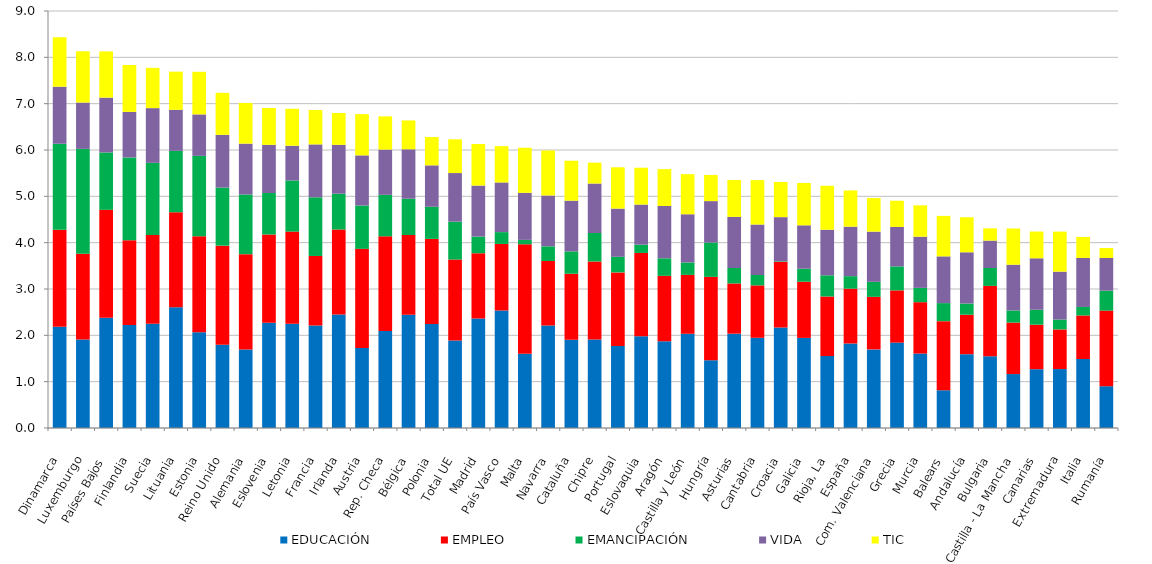
| Category | EDUCACIÓN | EMPLEO | EMANCIPACIÓN | VIDA | TIC |
|---|---|---|---|---|---|
| Dinamarca | 2.185 | 2.095 | 1.855 | 1.231 | 1.067 |
| Luxemburgo | 1.912 | 1.848 | 2.264 | 1 | 1.107 |
| Países Bajos | 2.382 | 2.327 | 1.239 | 1.182 | 0.997 |
| Finlandia | 2.22 | 1.83 | 1.789 | 0.983 | 1.012 |
| Suecia | 2.248 | 1.916 | 1.558 | 1.181 | 0.869 |
| Lituania | 2.605 | 2.052 | 1.325 | 0.885 | 0.825 |
| Estonia | 2.066 | 2.073 | 1.735 | 0.895 | 0.92 |
| Reino Unido | 1.794 | 2.141 | 1.253 | 1.138 | 0.906 |
| Alemania | 1.695 | 2.056 | 1.289 | 1.097 | 0.878 |
| Eslovenia | 2.27 | 1.906 | 0.895 | 1.04 | 0.795 |
| Letonia | 2.25 | 1.989 | 1.104 | 0.749 | 0.798 |
| Francia | 2.215 | 1.499 | 1.267 | 1.141 | 0.742 |
| Irlanda | 2.449 | 1.834 | 0.773 | 1.054 | 0.688 |
| Austria | 1.726 | 2.14 | 0.936 | 1.082 | 0.89 |
| Rep. Checa | 2.095 | 2.041 | 0.895 | 0.977 | 0.717 |
| Bélgica | 2.443 | 1.723 | 0.782 | 1.068 | 0.622 |
| Polonia | 2.245 | 1.837 | 0.693 | 0.894 | 0.61 |
| Total UE | 1.886 | 1.75 | 0.818 | 1.049 | 0.728 |
| Madrid | 2.366 | 1.407 | 0.359 | 1.101 | 0.898 |
| País Vasco | 2.534 | 1.439 | 0.255 | 1.072 | 0.783 |
| Malta | 1.6 | 2.366 | 0.094 | 1.015 | 0.973 |
| Navarra | 2.211 | 1.393 | 0.318 | 1.096 | 0.972 |
| Cataluña | 1.906 | 1.423 | 0.482 | 1.095 | 0.862 |
| Chipre | 1.912 | 1.682 | 0.616 | 1.067 | 0.45 |
| Portugal | 1.768 | 1.59 | 0.336 | 1.04 | 0.892 |
| Eslovaquia | 1.978 | 1.801 | 0.179 | 0.865 | 0.795 |
| Aragón | 1.87 | 1.415 | 0.378 | 1.128 | 0.796 |
| Castilla y León | 2.034 | 1.271 | 0.269 | 1.04 | 0.866 |
| Hungría | 1.462 | 1.799 | 0.741 | 0.895 | 0.565 |
| Asturias | 2.036 | 1.084 | 0.334 | 1.103 | 0.796 |
| Cantabria | 1.947 | 1.131 | 0.225 | 1.089 | 0.959 |
| Croacia | 2.17 | 1.42 | 0.011 | 0.95 | 0.759 |
| Galicia | 1.944 | 1.213 | 0.28 | 0.937 | 0.914 |
| Rioja, La | 1.553 | 1.286 | 0.457 | 0.983 | 0.949 |
| España | 1.824 | 1.183 | 0.27 | 1.067 | 0.783 |
| Com. Valenciana | 1.697 | 1.134 | 0.324 | 1.084 | 0.724 |
| Grecia | 1.843 | 1.128 | 0.517 | 0.851 | 0.566 |
| Murcia | 1.607 | 1.109 | 0.309 | 1.104 | 0.677 |
| Balears | 0.815 | 1.491 | 0.389 | 1.009 | 0.873 |
| Andalucía | 1.593 | 0.852 | 0.241 | 1.106 | 0.756 |
| Bulgaria | 1.547 | 1.52 | 0.386 | 0.591 | 0.265 |
| Castilla - La Mancha | 1.164 | 1.111 | 0.262 | 0.987 | 0.782 |
| Canarias | 1.269 | 0.961 | 0.322 | 1.111 | 0.578 |
| Extremadura | 1.272 | 0.855 | 0.213 | 1.033 | 0.864 |
| Italia | 1.489 | 0.94 | 0.184 | 1.058 | 0.454 |
| Rumanía | 0.902 | 1.632 | 0.43 | 0.706 | 0.214 |